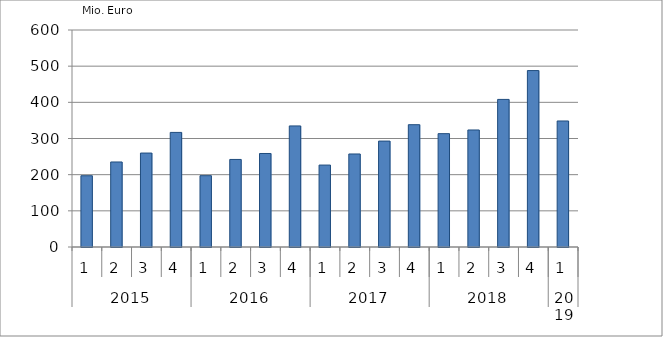
| Category | Ausbaugewerblicher Umsatz3 |
|---|---|
| 0 | 197030.42 |
| 1 | 235094.994 |
| 2 | 259758.438 |
| 3 | 316833.232 |
| 4 | 197219.532 |
| 5 | 242069.899 |
| 6 | 258547.84 |
| 7 | 334764.305 |
| 8 | 226552.317 |
| 9 | 257191.13 |
| 10 | 292853.372 |
| 11 | 338154.691 |
| 12 | 313433.569 |
| 13 | 323547.694 |
| 14 | 408057.42 |
| 15 | 487843.765 |
| 16 | 348466.115 |